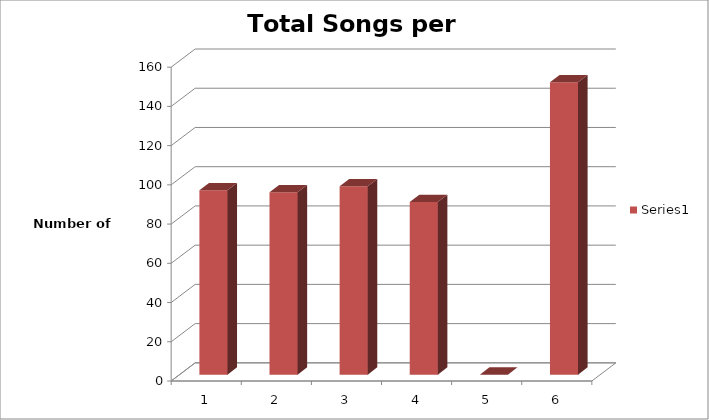
| Category | Series 1 |
|---|---|
| 0 | 94 |
| 1 | 93 |
| 2 | 96 |
| 3 | 88 |
| 4 | 0 |
| 5 | 149 |